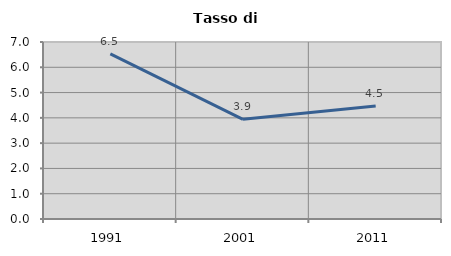
| Category | Tasso di disoccupazione   |
|---|---|
| 1991.0 | 6.533 |
| 2001.0 | 3.942 |
| 2011.0 | 4.469 |